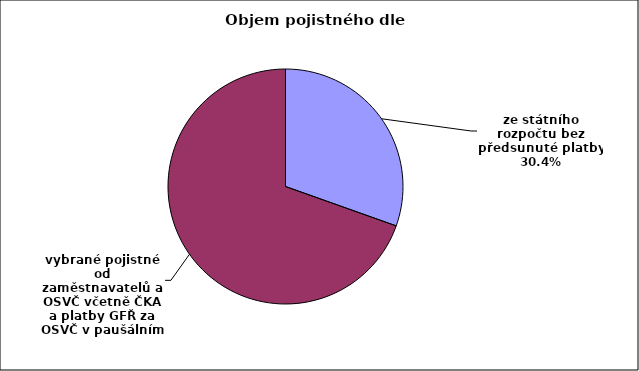
| Category | Series 0 |
|---|---|
| ze státního rozpočtu bez předsunuté platby | 0.304 |
| vybrané pojistné od zaměstnavatelů a OSVČ včetně ČKA a platby GFŘ za OSVČ v paušálním režimu | 0.696 |